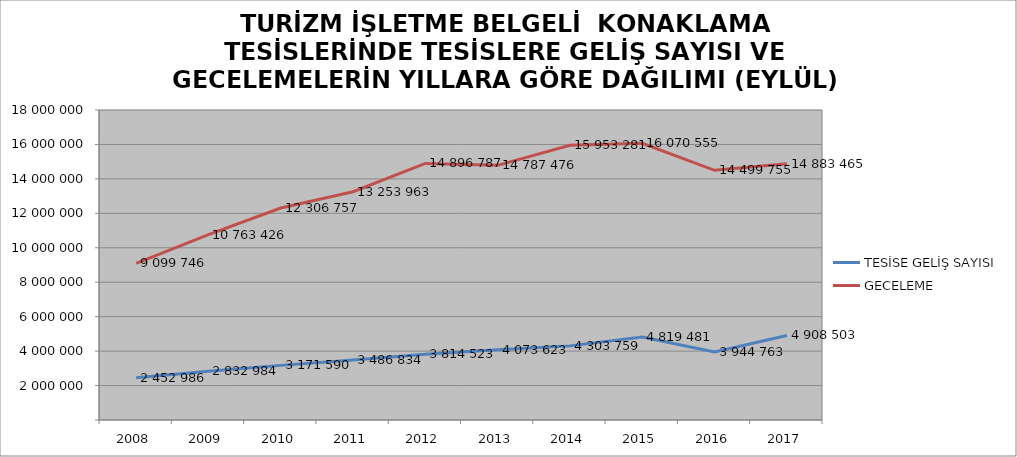
| Category | TESİSE GELİŞ SAYISI | GECELEME |
|---|---|---|
| 2008 | 2452986 | 9099746 |
| 2009 | 2832984 | 10763426 |
| 2010 | 3171590 | 12306757 |
| 2011 | 3486834 | 13253963 |
| 2012 | 3814523 | 14896787 |
| 2013 | 4073623 | 14787476 |
| 2014 | 4303759 | 15953281 |
| 2015 | 4819481 | 16070555 |
| 2016 | 3944763 | 14499755 |
| 2017 | 4908503 | 14883465 |